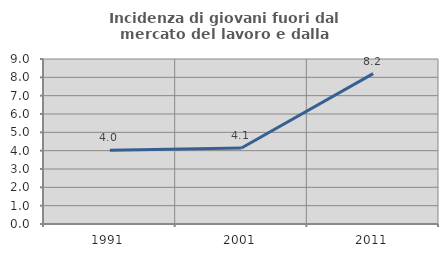
| Category | Incidenza di giovani fuori dal mercato del lavoro e dalla formazione  |
|---|---|
| 1991.0 | 4.024 |
| 2001.0 | 4.145 |
| 2011.0 | 8.202 |